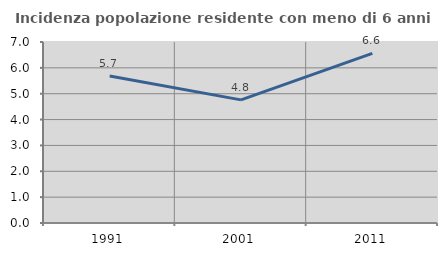
| Category | Incidenza popolazione residente con meno di 6 anni |
|---|---|
| 1991.0 | 5.684 |
| 2001.0 | 4.762 |
| 2011.0 | 6.56 |